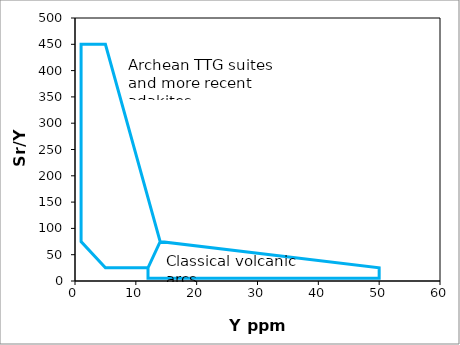
| Category | Series 0 |
|---|---|
| 12.0 | 25 |
| 12.0 | 5 |
| 50.0 | 5 |
| 50.0 | 25 |
| 14.0 | 75 |
| 5.0 | 450 |
| 1.0 | 450 |
| 1.0 | 75 |
| 5.0 | 25 |
| 12.0 | 25 |
| 14.0 | 75 |